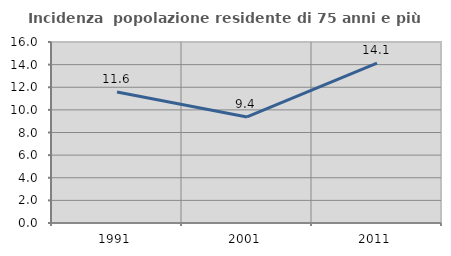
| Category | Incidenza  popolazione residente di 75 anni e più |
|---|---|
| 1991.0 | 11.579 |
| 2001.0 | 9.375 |
| 2011.0 | 14.141 |